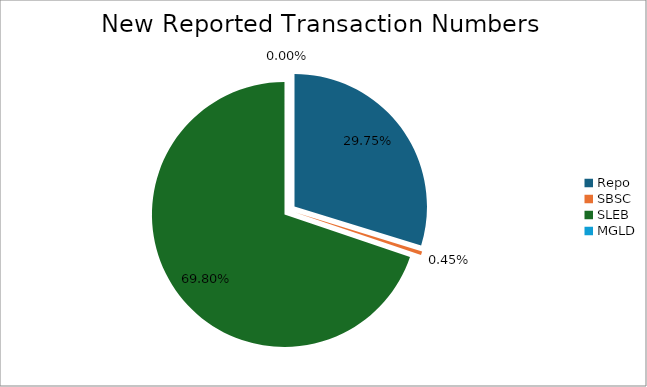
| Category | Series 0 |
|---|---|
| Repo | 354901 |
| SBSC | 5354 |
| SLEB | 832578 |
| MGLD | 27 |